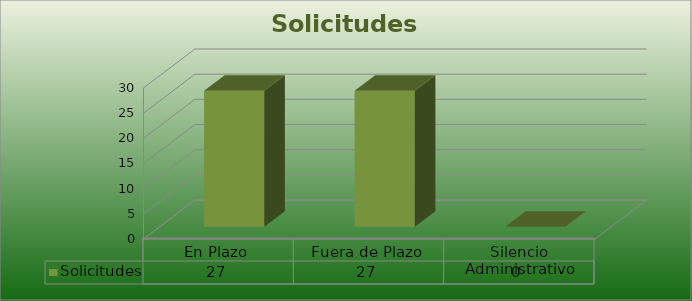
| Category | Solicitudes |
|---|---|
| En Plazo | 27 |
| Fuera de Plazo | 27 |
| Silencio Administrativo | 0 |